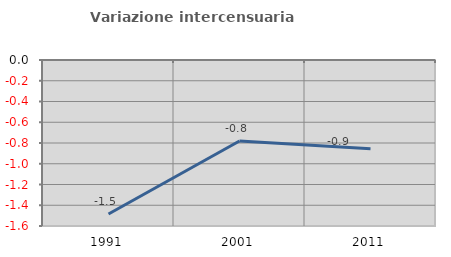
| Category | Variazione intercensuaria annua |
|---|---|
| 1991.0 | -1.485 |
| 2001.0 | -0.78 |
| 2011.0 | -0.856 |